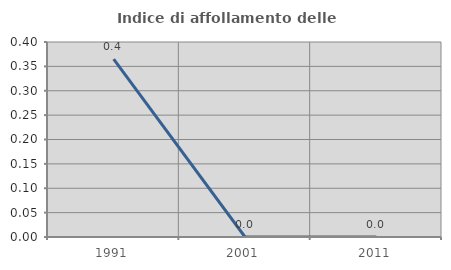
| Category | Indice di affollamento delle abitazioni  |
|---|---|
| 1991.0 | 0.365 |
| 2001.0 | 0 |
| 2011.0 | 0 |